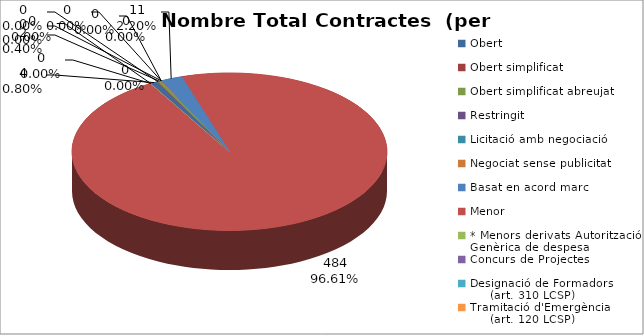
| Category | Nombre Total Contractes |
|---|---|
| Obert | 4 |
| Obert simplificat | 0 |
| Obert simplificat abreujat | 2 |
| Restringit | 0 |
| Licitació amb negociació | 0 |
| Negociat sense publicitat | 0 |
| Basat en acord marc | 11 |
| Menor | 484 |
| * Menors derivats Autorització Genèrica de despesa | 0 |
| Concurs de Projectes | 0 |
| Designació de Formadors
     (art. 310 LCSP) | 0 |
| Tramitació d'Emergència
     (art. 120 LCSP) | 0 |